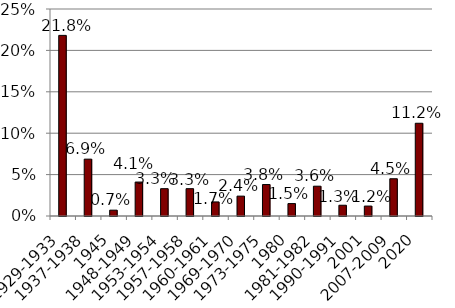
| Category | Series 2 |
|---|---|
| 1929-1933 | 0.218 |
| 1937-1938 | 0.069 |
| 1945 | 0.007 |
| 1948-1949 | 0.041 |
| 1953-1954 | 0.033 |
| 1957-1958 | 0.033 |
| 1960-1961 | 0.017 |
| 1969-1970 | 0.024 |
| 1973-1975 | 0.038 |
| 1980 | 0.015 |
| 1981-1982 | 0.036 |
| 1990-1991 | 0.013 |
| 2001 | 0.012 |
| 2007-2009 | 0.045 |
| 2020 | 0.112 |